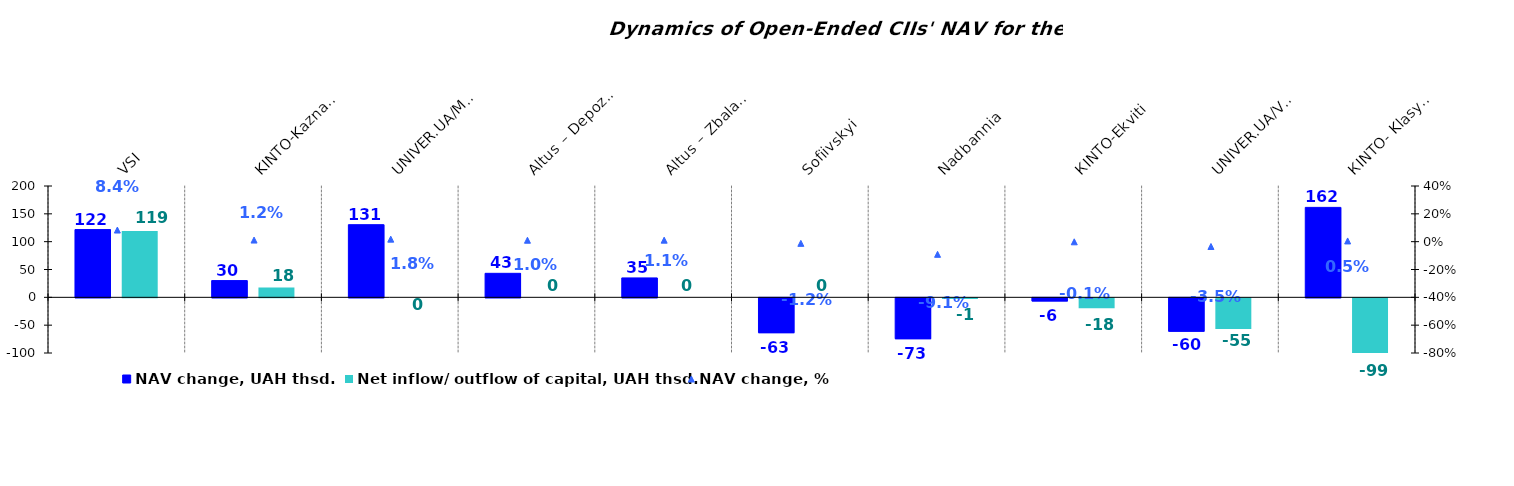
| Category | NAV change, UAH thsd. | Net inflow/ outflow of capital, UAH thsd. |
|---|---|---|
| VSI | 121.712 | 119.057 |
| KINTO-Kaznacheiskyi | 30.069 | 17.753 |
| UNIVER.UA/Myhailo Hrushevskyi: Fond Derzhavnykh Paperiv    | 130.502 | 0 |
| Altus – Depozyt | 43.149 | 0 |
| Altus – Zbalansovanyi | 34.889 | 0 |
| Sofiivskyi | -62.53 | 0 |
| Nadbannia | -73.395 | -1.156 |
| КІNТО-Еkviti | -5.58 | -17.71 |
| UNIVER.UA/Volodymyr Velykyi: Fond Zbalansovanyi | -60.009 | -54.937 |
| КІNТО- Klasychnyi | 161.596 | -99.225 |